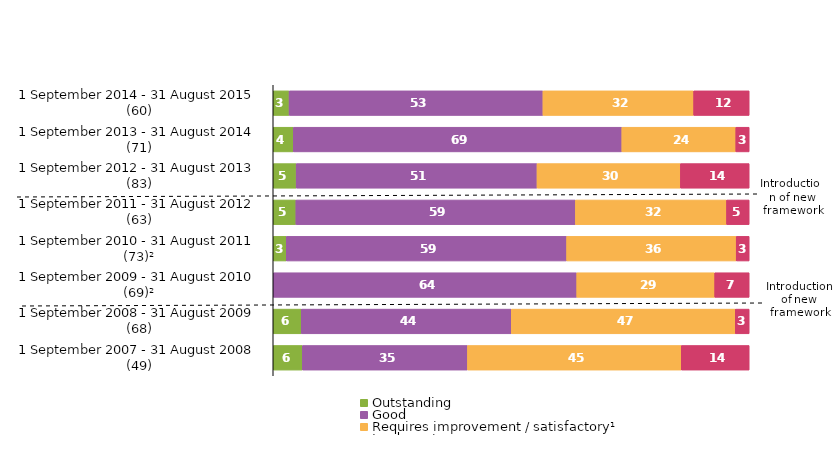
| Category | Outstanding | Good | Requires improvement / satisfactory¹ | Inadequate |
|---|---|---|---|---|
| 1 September 2014 - 31 August 2015 (60) | 3.333 | 53.333 | 31.667 | 11.667 |
| 1 September 2013 - 31 August 2014 (71) | 4.225 | 69.014 | 23.944 | 2.817 |
| 1 September 2012 - 31 August 2013 (83) | 4.819 | 50.602 | 30.12 | 14.458 |
| 1 September 2011 - 31 August 2012 (63) | 4.762 | 58.73 | 31.746 | 4.762 |
| 1 September 2010 - 31 August 2011 (73)² | 2.74 | 58.904 | 35.616 | 2.74 |
| 1 September 2009 - 31 August 2010 (69)² | 0 | 63.768 | 28.986 | 7.246 |
| 1 September 2008 - 31 August 2009 (68) | 5.882 | 44.118 | 47.059 | 2.941 |
| 1 September 2007 - 31 August 2008 (49) | 6.122 | 34.694 | 44.898 | 14.286 |